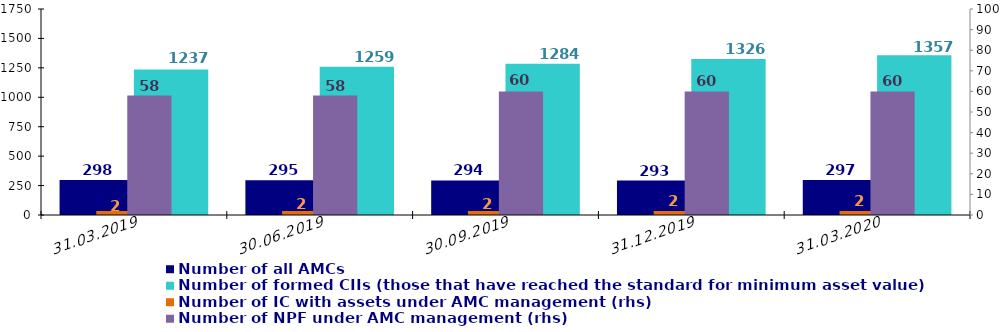
| Category | Number of registered CIIs per one AMC | Number of all AMCs | Number of AMCs with CII under management | Number of formed CIIs (those that have reached the standard for minimum asset value) |
|---|---|---|---|---|
| 31.03.2019 |  | 298 |  | 1237 |
| 30.06.2019 |  | 295 |  | 1259 |
| 30.09.2019 |  | 294 |  | 1284 |
| 31.12.2019 |  | 293 |  | 1326 |
| 31.03.2020 |  | 297 |  | 1357 |